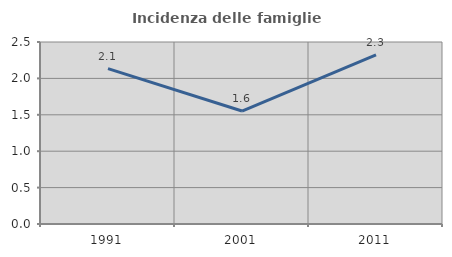
| Category | Incidenza delle famiglie numerose |
|---|---|
| 1991.0 | 2.134 |
| 2001.0 | 1.552 |
| 2011.0 | 2.323 |